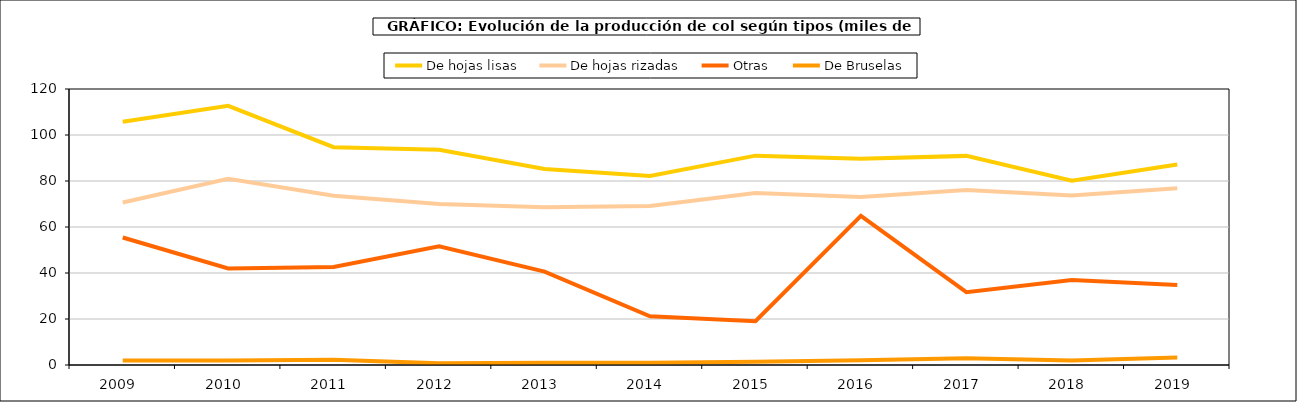
| Category | De hojas lisas | De hojas rizadas | Otras | De Bruselas |
|---|---|---|---|---|
| 2009.0 | 105.759 | 70.664 | 55.438 | 2.005 |
| 2010.0 | 112.708 | 80.922 | 41.958 | 1.972 |
| 2011.0 | 94.724 | 73.591 | 42.575 | 2.237 |
| 2012.0 | 93.549 | 70.008 | 51.596 | 0.731 |
| 2013.0 | 85.207 | 68.536 | 40.593 | 0.965 |
| 2014.0 | 82.165 | 69.098 | 21.166 | 1.025 |
| 2015.0 | 91.025 | 74.746 | 19.06 | 1.371 |
| 2016.0 | 89.719 | 73.058 | 64.818 | 2.023 |
| 2017.0 | 90.922 | 76.042 | 31.66 | 2.985 |
| 2018.0 | 80.113 | 73.721 | 36.915 | 1.984 |
| 2019.0 | 87.207 | 76.809 | 34.763 | 3.306 |